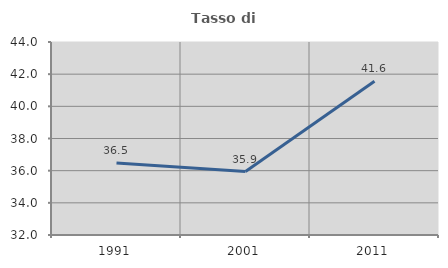
| Category | Tasso di occupazione   |
|---|---|
| 1991.0 | 36.481 |
| 2001.0 | 35.945 |
| 2011.0 | 41.554 |